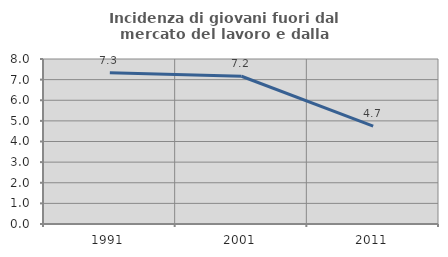
| Category | Incidenza di giovani fuori dal mercato del lavoro e dalla formazione  |
|---|---|
| 1991.0 | 7.337 |
| 2001.0 | 7.163 |
| 2011.0 | 4.747 |